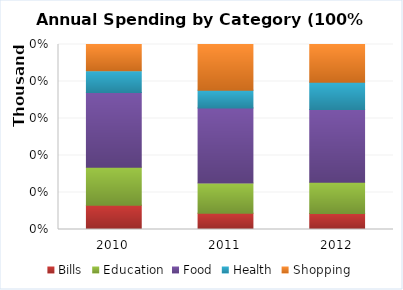
| Category | Bills | Education | Food | Health | Shopping |
|---|---|---|---|---|---|
| 2010.0 | 3785.581 | 5893.992 | 11655.462 | 3379.324 | 4075.61 |
| 2011.0 | 2291.988 | 4242.892 | 10520.331 | 2504.892 | 6415.392 |
| 2012.0 | 2145.344 | 4150.561 | 9714.334 | 3607.436 | 5046.717 |